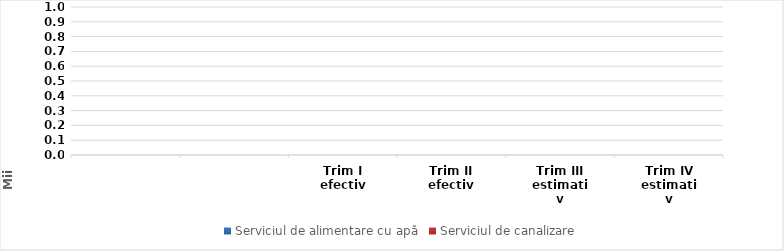
| Category | Serviciul de alimentare cu apă | Serviciul de canalizare |
|---|---|---|
|  | 0 | 0 |
|  | 0 | 0 |
| Trim I
efectiv | 0 | 0 |
| Trim II
efectiv | 0 | 0 |
| Trim III
estimativ | 0 | 0 |
| Trim IV
estimativ | 0 | 0 |